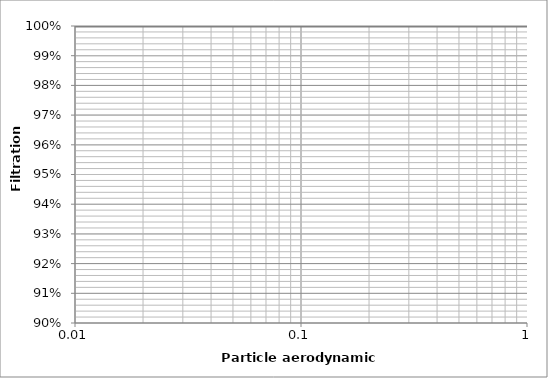
| Category | Filter efficiency |
|---|---|
| 0.001 | 1 |
| 0.01 | 1 |
| 0.025 | 1 |
| 0.05 | 1 |
| 0.1 | 1 |
| 0.15 | 1 |
| 0.2 | 1 |
| 0.3 | 1 |
| 0.4 | 1 |
| 0.5 | 1 |
| 0.6 | 1 |
| 0.7 | 1 |
| 0.8 | 1 |
| 0.9 | 1 |
| 1.0 | 1 |
| 1.5 | 1 |
| 2.0 | 1 |
| 2.5 | 1 |
| 3.0 | 1 |
| 3.5 | 1 |
| 4.0 | 1 |
| 4.5 | 1 |
| 5.0 | 1 |
| 5.5 | 1 |
| 6.0 | 1 |
| 6.5 | 1 |
| 7.0 | 1 |
| 7.5 | 1 |
| 8.0 | 1 |
| 8.5 | 1 |
| 9.0 | 1 |
| 9.5 | 1 |
| 10.0 | 1 |